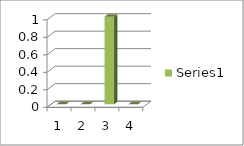
| Category | Series 0 |
|---|---|
| 0 | 0 |
| 1 | 0 |
| 2 | 1 |
| 3 | 0 |